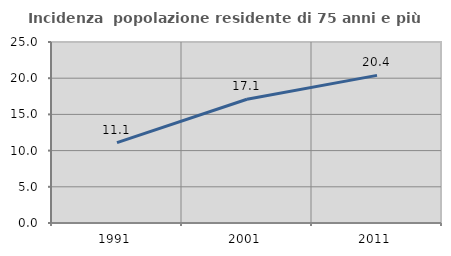
| Category | Incidenza  popolazione residente di 75 anni e più |
|---|---|
| 1991.0 | 11.098 |
| 2001.0 | 17.097 |
| 2011.0 | 20.39 |